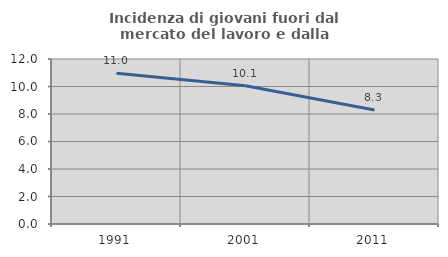
| Category | Incidenza di giovani fuori dal mercato del lavoro e dalla formazione  |
|---|---|
| 1991.0 | 10.965 |
| 2001.0 | 10.05 |
| 2011.0 | 8.287 |